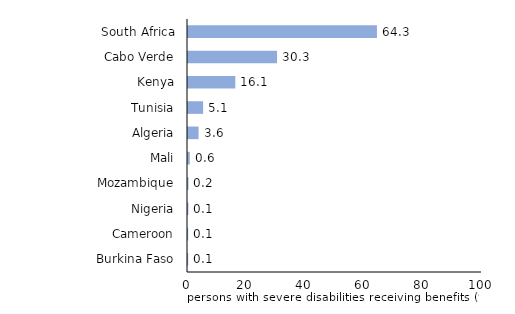
| Category | Persons with severe disabilities receiving benefits, % of persons with severe disabilities |
|---|---|
| Burkina Faso | 0.062 |
| Cameroon | 0.064 |
| Nigeria | 0.12 |
| Mozambique | 0.159 |
| Mali | 0.604 |
| Algeria | 3.596 |
| Tunisia | 5.143 |
| Kenya | 16.1 |
| Cabo Verde | 30.3 |
| South Africa | 64.263 |